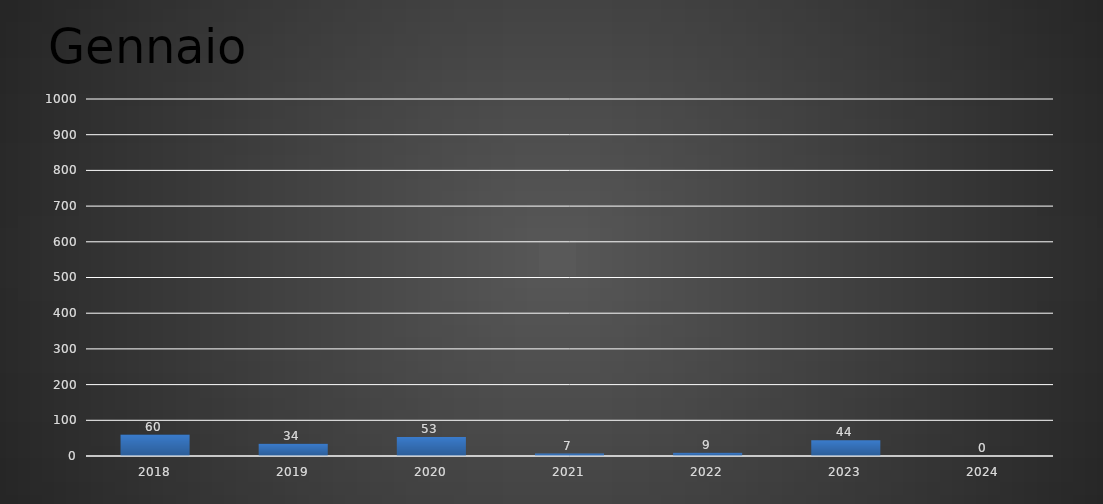
| Category | Gennaio |
|---|---|
| 2018.0 | 60 |
| 2019.0 | 34 |
| 2020.0 | 53 |
| 2021.0 | 7 |
| 2022.0 | 9 |
| 2023.0 | 44 |
| 2024.0 | 0 |